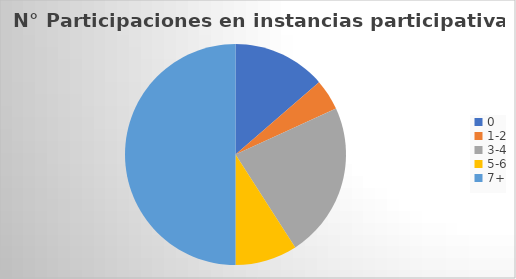
| Category | Series 0 |
|---|---|
| 0 | 3 |
| 1-2 | 1 |
| 3-4 | 5 |
| 5-6 | 2 |
| 7+ | 11 |